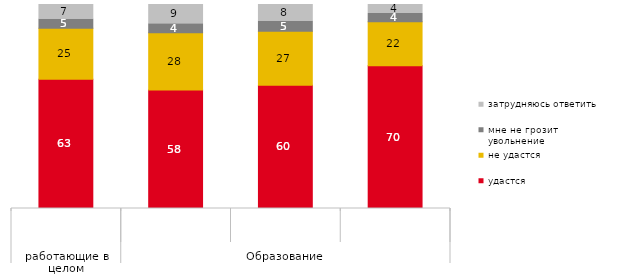
| Category | удастся | не удастся | мне не грозит увольнение | затрудняюсь ответить |
|---|---|---|---|---|
| 0 | 63.314 | 25.096 | 4.502 | 7.088 |
| 1 | 58.029 | 28.102 | 4.38 | 9.489 |
| 2 | 60.367 | 26.509 | 4.987 | 8.136 |
| 3 | 69.923 | 21.594 | 4.113 | 4.37 |